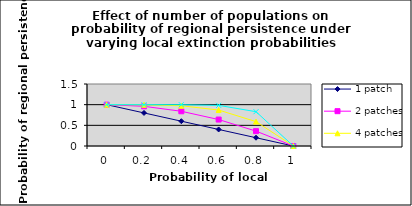
| Category | 1 patch | 2 patches | 4 patches | 8 patches |
|---|---|---|---|---|
| 0.0 | 1 | 1 | 1 | 1 |
| 0.2 | 0.8 | 0.96 | 0.998 | 0.999 |
| 0.4 | 0.6 | 0.84 | 0.974 | 0.999 |
| 0.6 | 0.4 | 0.64 | 0.87 | 0.983 |
| 0.8 | 0.2 | 0.36 | 0.59 | 0.83 |
| 1.0 | 0 | 0 | 0 | 0 |